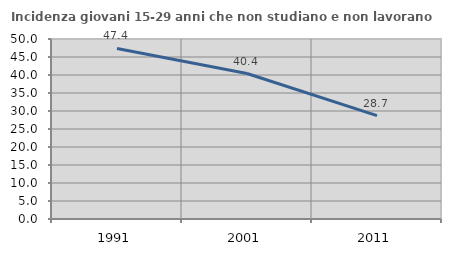
| Category | Incidenza giovani 15-29 anni che non studiano e non lavorano  |
|---|---|
| 1991.0 | 47.381 |
| 2001.0 | 40.407 |
| 2011.0 | 28.711 |